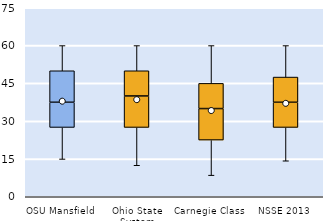
| Category | 25th | 50th | 75th |
|---|---|---|---|
| OSU Mansfield | 27.5 | 10 | 12.5 |
| Ohio State System | 27.5 | 12.5 | 10 |
| Carnegie Class | 22.5 | 12.5 | 10 |
| NSSE 2013 | 27.5 | 10 | 10 |